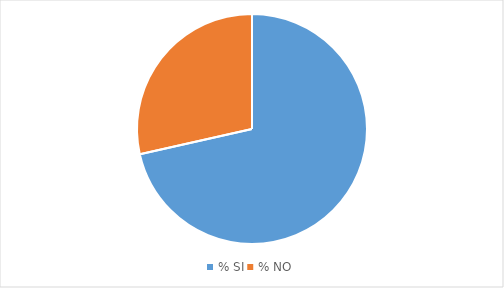
| Category | Series 0 | Series 1 | Series 2 | Series 3 | Series 4 | Series 5 | Series 6 | Series 7 | Series 8 | Series 9 |
|---|---|---|---|---|---|---|---|---|---|---|
| % SI | 3.86 | 1.93 | 4.63 | 5.79 | 7.72 | 3.09 | 9.27 | 8.49 | 3.09 | 7.72 |
| % NO | 1.54 | 1.93 | 3.09 | 5.41 | 7.34 | 8.88 | 5.02 | 4.63 | 3.09 | 3.47 |